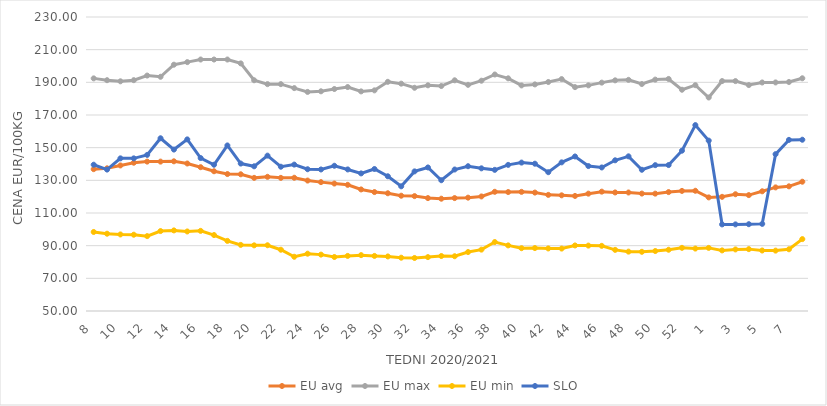
| Category | EU avg | EU max | EU min | SLO |
|---|---|---|---|---|
| 8.0 | 136.846 | 192.42 | 98.381 | 139.56 |
| 9.0 | 137.361 | 191.31 | 97.323 | 136.58 |
| 10.0 | 139.118 | 190.63 | 96.874 | 143.45 |
| 11.0 | 140.789 | 191.32 | 96.705 | 143.45 |
| 12.0 | 141.467 | 194.15 | 95.845 | 145.57 |
| 13.0 | 141.466 | 193.4 | 98.945 | 155.76 |
| 14.0 | 141.645 | 200.79 | 99.347 | 148.84 |
| 15.0 | 140.306 | 202.38 | 98.696 | 155.07 |
| 16.0 | 138.046 | 203.97 | 99.065 | 143.65 |
| 17.0 | 135.556 | 203.97 | 96.499 | 139.55 |
| 18.0 | 133.857 | 203.97 | 92.931 | 151.36 |
| 19.0 | 133.702 | 201.59 | 90.48 | 140.27 |
| 20.0 | 131.51 | 191.27 | 90.199 | 138.59 |
| 21.0 | 132.157 | 188.89 | 90.255 | 145.12 |
| 22.0 | 131.509 | 188.89 | 87.513 | 138.33 |
| 23.0 | 131.578 | 186.47 | 83.199 | 139.64 |
| 24.0 | 129.861 | 184.13 | 85.09 | 136.79 |
| 25.0 | 128.899 | 184.51 | 84.52 | 136.65 |
| 26.0 | 128.034 | 185.91 | 83.06 | 138.92 |
| 27.0 | 127.242 | 187.11 | 83.73 | 136.67 |
| 28.0 | 124.426 | 184.46 | 84.2 | 134.25 |
| 29.0 | 122.822 | 185.09 | 83.72 | 136.94 |
| 30.0 | 122.086 | 190.31 | 83.4 | 132.48 |
| 31.0 | 120.581 | 189.19 | 82.63 | 126.34 |
| 32.0 | 120.341 | 186.67 | 82.46 | 135.48 |
| 33.0 | 119.127 | 188.18 | 82.99 | 137.89 |
| 34.0 | 118.75 | 187.74 | 83.66 | 130.07 |
| 35.0 | 119.136 | 191.25 | 83.53 | 136.63 |
| 36.0 | 119.398 | 188.47 | 86.09 | 138.64 |
| 37.0 | 120.135 | 190.99 | 87.57 | 137.35 |
| 38.0 | 122.982 | 194.8 | 92.21 | 136.42 |
| 39.0 | 122.832 | 192.45 | 90.16 | 139.46 |
| 40.0 | 122.936 | 188.11 | 88.45 | 140.87 |
| 41.0 | 122.507 | 188.73 | 88.54 | 140.18 |
| 42.0 | 121.098 | 190.2 | 88.3 | 134.98 |
| 43.0 | 120.822 | 191.99 | 88.22 | 141 |
| 44.0 | 120.448 | 187.06 | 90.13 | 144.61 |
| 45.0 | 121.843 | 188.15 | 90.04 | 138.73 |
| 46.0 | 123.07 | 189.82 | 89.89 | 137.88 |
| 47.0 | 122.58 | 191.22 | 87.43 | 142.27 |
| 48.0 | 122.553 | 191.52 | 86.35 | 144.69 |
| 49.0 | 121.893 | 188.97 | 86.24 | 136.47 |
| 50.0 | 121.851 | 191.67 | 86.72 | 139.29 |
| 51.0 | 122.8 | 192.06 | 87.5 | 139.35 |
| 52.0 | 123.52 | 185.468 | 88.67 | 148.16 |
| 53.0 | 123.611 | 188.25 | 88.23 | 163.81 |
| 1.0 | 119.553 | 180.72 | 88.64 | 154.31 |
| 2.0 | 119.893 | 190.77 | 87.1 | 103.02 |
| 3.0 | 121.489 | 190.76 | 87.7 | 103.03 |
| 4.0 | 120.954 | 188.33 | 87.88 | 103.15 |
| 5.0 | 123.293 | 189.91 | 87.04 | 103.34 |
| 6.0 | 125.679 | 189.94 | 86.97 | 146.03 |
| 7.0 | 126.326 | 190.21 | 87.79 | 154.77 |
| 8.0 | 129.154 | 192.48 | 94.02 | 154.86 |